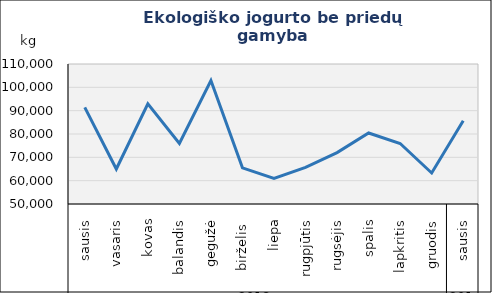
| Category | Jogurtas be priedų |
|---|---|
| 0 | 91427 |
| 1 | 64989 |
| 2 | 92936 |
| 3 | 75942 |
| 4 | 102902 |
| 5 | 65485 |
| 6 | 60967 |
| 7 | 65692 |
| 8 | 72041 |
| 9 | 80421 |
| 10 | 75933 |
| 11 | 63294 |
| 12 | 85686 |